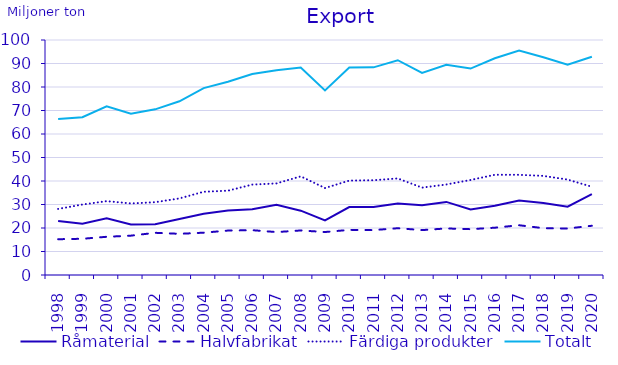
| Category | Råmaterial | Halvfabrikat | Färdiga produkter | Totalt |
|---|---|---|---|---|
| 1998.0 | 23.014 | 15.225 | 28.118 | 66.356 |
| 1999.0 | 21.768 | 15.418 | 29.983 | 67.169 |
| 2000.0 | 24.092 | 16.259 | 31.435 | 71.786 |
| 2001.0 | 21.458 | 16.744 | 30.44 | 68.642 |
| 2002.0 | 21.553 | 17.952 | 30.983 | 70.488 |
| 2003.0 | 23.794 | 17.523 | 32.59 | 73.906 |
| 2004.0 | 26.099 | 18.01 | 35.421 | 79.53 |
| 2005.0 | 27.44 | 18.905 | 35.877 | 82.222 |
| 2006.0 | 28.008 | 19.074 | 38.469 | 85.551 |
| 2007.0 | 29.901 | 18.267 | 38.976 | 87.144 |
| 2008.0 | 27.364 | 18.951 | 41.977 | 88.292 |
| 2009.0 | 23.233 | 18.287 | 36.999 | 78.518 |
| 2010.0 | 28.899 | 19.203 | 40.179 | 88.281 |
| 2011.0 | 28.913 | 19.112 | 40.328 | 88.353 |
| 2012.0 | 30.4 | 19.907 | 41.083 | 91.39 |
| 2013.0 | 29.709 | 19.106 | 37.177 | 85.992 |
| 2014.0 | 31.1 | 19.806 | 38.513 | 89.419 |
| 2015.0 | 27.91 | 19.502 | 40.427 | 87.84 |
| 2016.0 | 29.44 | 20.124 | 42.654 | 92.218 |
| 2017.0 | 31.692 | 21.176 | 42.627 | 95.496 |
| 2018.0 | 30.59 | 19.922 | 42.174 | 92.686 |
| 2019.0 | 29.098 | 19.797 | 40.599 | 89.494 |
| 2020.0 | 34.37 | 20.951 | 37.553 | 92.874 |